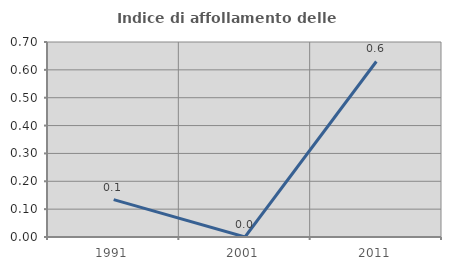
| Category | Indice di affollamento delle abitazioni  |
|---|---|
| 1991.0 | 0.134 |
| 2001.0 | 0 |
| 2011.0 | 0.63 |